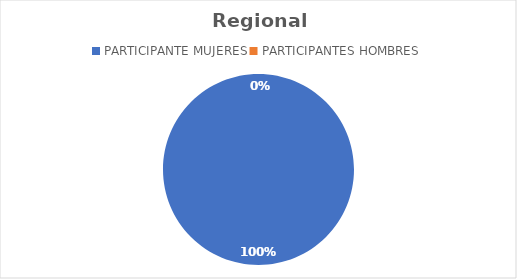
| Category | Regional Este |
|---|---|
| PARTICIPANTE MUJERES | 104 |
| PARTICIPANTES HOMBRES | 0 |